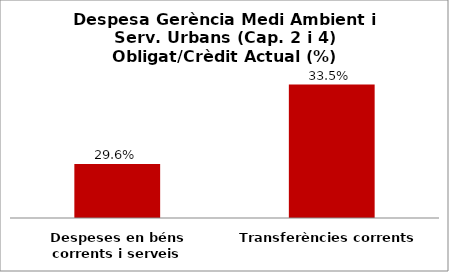
| Category | Series 0 |
|---|---|
| Despeses en béns corrents i serveis | 0.296 |
| Transferències corrents | 0.335 |